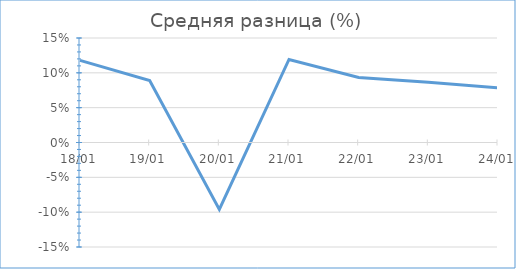
| Category | Средняя разница (%) |
|---|---|
| 2016-01-18 | 0.118 |
| 2016-01-19 | 0.089 |
| 2016-01-20 | -0.096 |
| 2016-01-21 | 0.119 |
| 2016-01-22 | 0.093 |
| 2016-01-23 | 0.086 |
| 2016-01-24 | 0.079 |